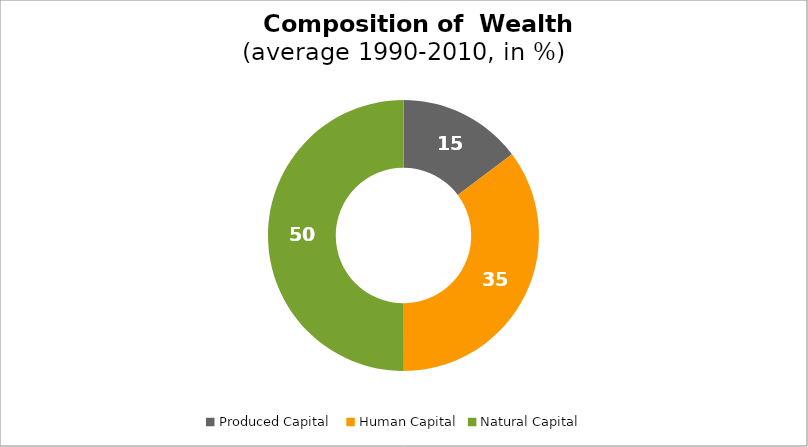
| Category | Series 0 |
|---|---|
| Produced Capital  | 14.777 |
| Human Capital | 35.19 |
| Natural Capital | 50.033 |